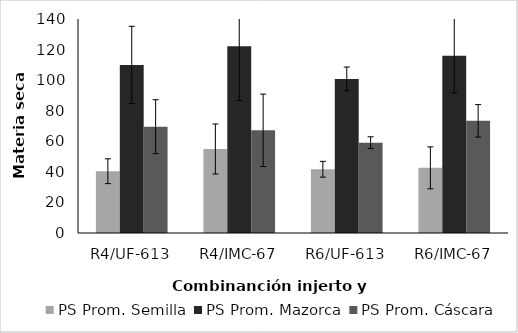
| Category | PS Prom. Semilla | PS Prom. Mazorca | PS Prom. Cáscara |
|---|---|---|---|
| R4/UF-613 | 40.417 | 109.965 | 69.55 |
| R4/IMC-67 | 54.94 | 122.113 | 67.177 |
| R6/UF-613 | 41.697 | 100.817 | 59.12 |
| R6/IMC-67 | 42.627 | 115.993 | 73.367 |